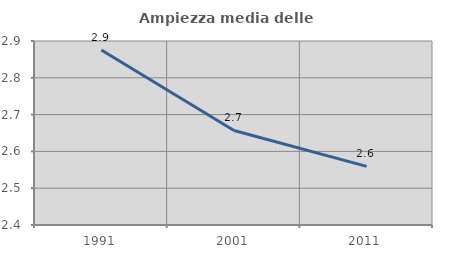
| Category | Ampiezza media delle famiglie |
|---|---|
| 1991.0 | 2.876 |
| 2001.0 | 2.657 |
| 2011.0 | 2.559 |